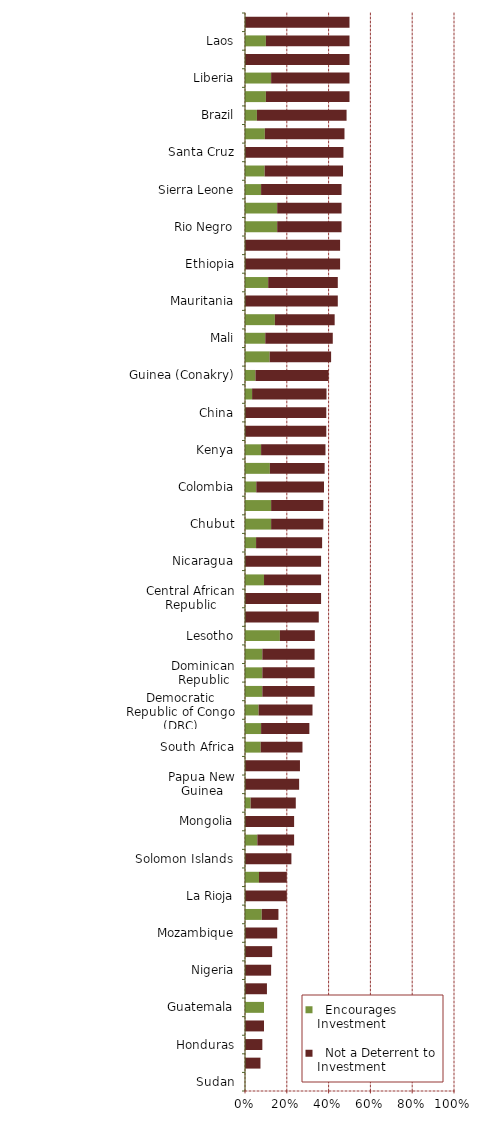
| Category |   Encourages Investment |   Not a Deterrent to Investment |
|---|---|---|
| Sudan | 0 | 0 |
| Zimbabwe | 0 | 0.074 |
| Honduras | 0 | 0.083 |
| South Sudan | 0 | 0.091 |
| Guatemala | 0.091 | 0 |
| Bolivia | 0 | 0.105 |
| Nigeria | 0 | 0.125 |
| Venezuela | 0 | 0.13 |
| Mozambique | 0 | 0.154 |
| Ecuador | 0.08 | 0.08 |
| La Rioja | 0 | 0.2 |
| Kyrgyzstan | 0.067 | 0.133 |
| Solomon Islands | 0 | 0.222 |
| Mendoza | 0.059 | 0.176 |
| Mongolia | 0 | 0.235 |
| Indonesia | 0.027 | 0.216 |
| Papua New Guinea | 0 | 0.259 |
| Philippines | 0 | 0.263 |
| South Africa | 0.075 | 0.2 |
| Jujuy | 0.077 | 0.231 |
| Democratic Republic of Congo (DRC) | 0.065 | 0.258 |
| Angola | 0.083 | 0.25 |
| Dominican Republic | 0.083 | 0.25 |
| Romania | 0.083 | 0.25 |
| Lesotho | 0.167 | 0.167 |
| Panama | 0 | 0.353 |
| Central African Republic | 0 | 0.364 |
| Neuquen | 0.091 | 0.273 |
| Nicaragua | 0 | 0.364 |
| Niger | 0.053 | 0.316 |
| Chubut | 0.125 | 0.25 |
| Thailand | 0.125 | 0.25 |
| Colombia | 0.054 | 0.324 |
| Nunavut | 0.119 | 0.262 |
| Kenya | 0.077 | 0.308 |
| Madagascar | 0 | 0.389 |
| China | 0 | 0.389 |
| Peru | 0.034 | 0.356 |
| Guinea (Conakry) | 0.05 | 0.35 |
| Eritrea | 0.118 | 0.294 |
| Mali | 0.097 | 0.323 |
| Russia | 0.143 | 0.286 |
| Mauritania | 0 | 0.444 |
| India | 0.111 | 0.333 |
| Ethiopia | 0 | 0.455 |
| Kazakhstan | 0 | 0.455 |
| Rio Negro | 0.154 | 0.308 |
| Myanmar | 0.154 | 0.308 |
| Sierra Leone | 0.077 | 0.385 |
| Tanzania | 0.094 | 0.375 |
| Santa Cruz | 0 | 0.471 |
| Zambia | 0.095 | 0.381 |
| Brazil | 0.057 | 0.429 |
| Ghana | 0.1 | 0.4 |
| Liberia | 0.125 | 0.375 |
| Catamarca | 0 | 0.5 |
| Laos | 0.1 | 0.4 |
| Vietnam | 0 | 0.5 |